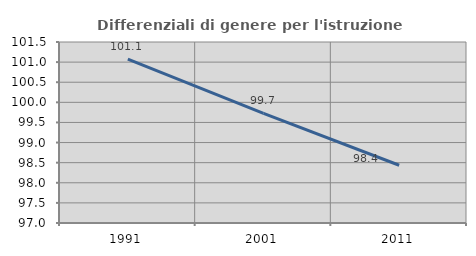
| Category | Differenziali di genere per l'istruzione superiore |
|---|---|
| 1991.0 | 101.076 |
| 2001.0 | 99.726 |
| 2011.0 | 98.436 |